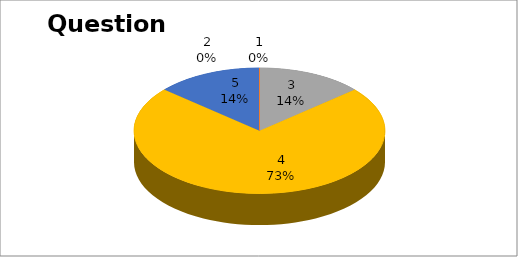
| Category | Series 0 |
|---|---|
| 0 | 0 |
| 1 | 0 |
| 2 | 3 |
| 3 | 16 |
| 4 | 3 |